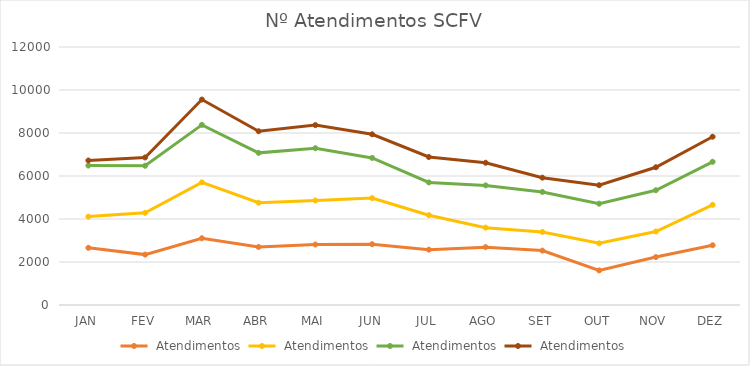
| Category | Sede | Santa Clara | São Francisco | Mapa |
|---|---|---|---|---|
| JAN | 2660 | 1452 | 2373 | 236 |
| FEV | 2344 | 1942 | 2191 | 386 |
| MAR | 3105 | 2598 | 2675 | 1178 |
| ABR | 2700 | 2057 | 2319 | 1005 |
| MAI | 2814 | 2046 | 2432 | 1075 |
| JUN | 2827 | 2144 | 1870 | 1099 |
| JUL | 2574 | 1604 | 1524 | 1181 |
| AGO | 2691 | 907 | 1965 | 1053 |
| SET | 2530 | 868 | 1862 | 663 |
| OUT | 1609 | 1259 | 1843 | 862 |
| NOV | 2229 | 1188 | 1921 | 1068 |
| DEZ | 2779 | 1882 | 2000 | 1166 |